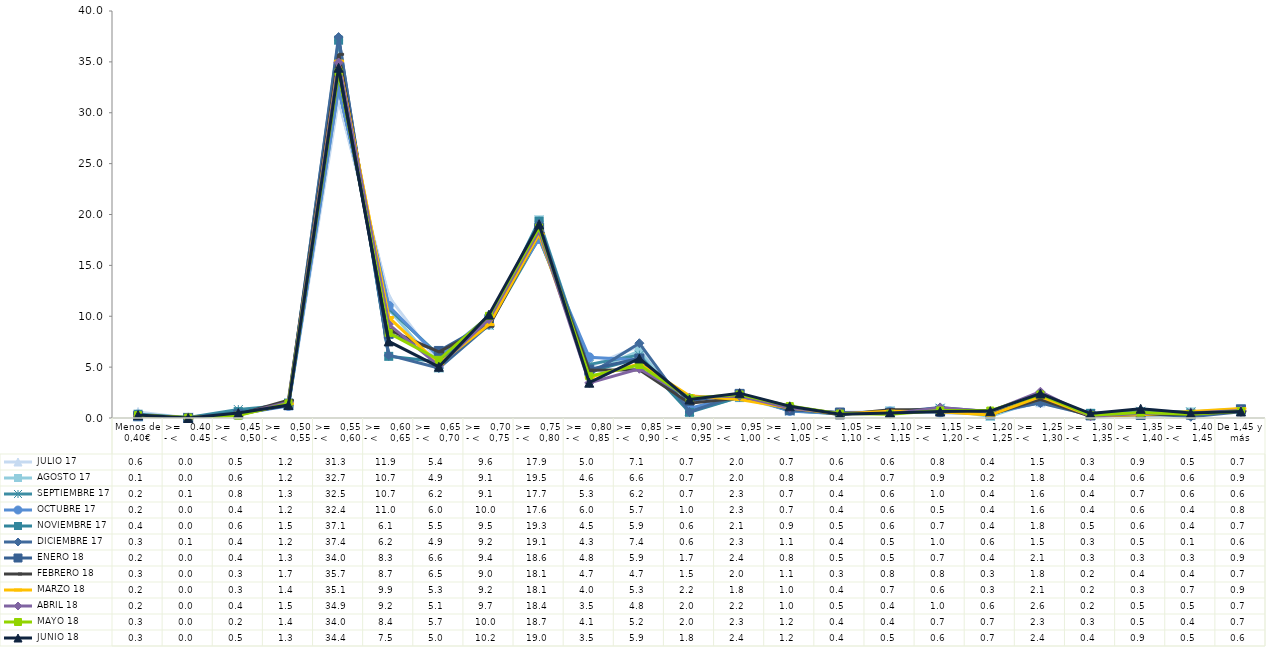
| Category |  JULIO 17 |  AGOSTO 17 |  SEPTIEMBRE 17 |  OCTUBRE 17 |  NOVIEMBRE 17 |  DICIEMBRE 17 |  ENERO 18 |  FEBRERO 18 |  MARZO 18 |  ABRIL 18 |  MAYO 18 |  JUNIO 18 |
|---|---|---|---|---|---|---|---|---|---|---|---|---|
| Menos de 0,40€ | 0.59 | 0.12 | 0.18 | 0.19 | 0.37 | 0.26 | 0.18 | 0.26 | 0.22 | 0.24 | 0.28 | 0.29 |
| >=   0.40 - <    0.45 | 0.01 | 0.01 | 0.06 | 0.01 | 0.04 | 0.05 | 0.01 | 0.01 | 0.02 | 0.01 | 0.04 | 0 |
| >=   0,45 - <    0,50 | 0.48 | 0.63 | 0.83 | 0.39 | 0.62 | 0.44 | 0.35 | 0.34 | 0.29 | 0.36 | 0.24 | 0.49 |
| >=   0,50 - <    0,55 | 1.21 | 1.23 | 1.27 | 1.19 | 1.47 | 1.24 | 1.3 | 1.74 | 1.42 | 1.54 | 1.44 | 1.27 |
| >=   0,55 - <    0,60 | 31.29 | 32.72 | 32.48 | 32.41 | 37.13 | 37.44 | 33.99 | 35.74 | 35.08 | 34.94 | 34 | 34.42 |
| >=   0,60 - <    0,65 | 11.93 | 10.7 | 10.74 | 11.03 | 6.06 | 6.18 | 8.27 | 8.67 | 9.88 | 9.21 | 8.36 | 7.53 |
| >=   0,65 - <   0,70 | 5.39 | 4.91 | 6.19 | 5.97 | 5.53 | 4.91 | 6.59 | 6.51 | 5.33 | 5.13 | 5.72 | 5.03 |
| >=   0,70 - <   0,75 | 9.55 | 9.13 | 9.14 | 9.99 | 9.48 | 9.16 | 9.36 | 9.03 | 9.18 | 9.71 | 10.04 | 10.16 |
| >=   0,75 - <   0,80 | 17.87 | 19.47 | 17.72 | 17.59 | 19.34 | 19.09 | 18.58 | 18.14 | 18.08 | 18.4 | 18.71 | 19.04 |
| >=   0,80 - <   0,85 | 5.04 | 4.59 | 5.27 | 5.97 | 4.54 | 4.29 | 4.76 | 4.69 | 3.99 | 3.45 | 4.1 | 3.47 |
| >=   0,85 - <   0,90 | 7.06 | 6.58 | 6.18 | 5.7 | 5.86 | 7.35 | 5.85 | 4.74 | 5.31 | 4.84 | 5.21 | 5.85 |
| >=   0,90 - <    0,95 | 0.69 | 0.7 | 0.73 | 0.95 | 0.56 | 0.59 | 1.68 | 1.45 | 2.19 | 2.01 | 1.95 | 1.82 |
| >=   0,95 - <   1,00 | 2.04 | 2.04 | 2.25 | 2.25 | 2.05 | 2.3 | 2.37 | 1.96 | 1.82 | 2.17 | 2.31 | 2.44 |
| >=   1,00 - <   1,05 | 0.71 | 0.78 | 0.68 | 0.7 | 0.91 | 1.08 | 0.78 | 1.09 | 0.97 | 0.99 | 1.17 | 1.15 |
| >=   1,05 - <    1,10 | 0.56 | 0.36 | 0.42 | 0.44 | 0.5 | 0.44 | 0.54 | 0.32 | 0.42 | 0.5 | 0.43 | 0.36 |
| >=   1,10 - <   1,15 | 0.61 | 0.7 | 0.56 | 0.63 | 0.55 | 0.53 | 0.51 | 0.8 | 0.66 | 0.41 | 0.37 | 0.5 |
| >=   1,15 - <    1,20 | 0.79 | 0.88 | 0.96 | 0.53 | 0.71 | 1.04 | 0.69 | 0.81 | 0.62 | 1.01 | 0.74 | 0.63 |
| >=   1,20 - <    1,25 | 0.37 | 0.16 | 0.41 | 0.41 | 0.38 | 0.61 | 0.35 | 0.34 | 0.29 | 0.63 | 0.73 | 0.68 |
| >=   1,25 - <    1,30 | 1.53 | 1.81 | 1.61 | 1.55 | 1.79 | 1.46 | 2.09 | 1.83 | 2.11 | 2.58 | 2.31 | 2.4 |
| >=   1,30 - <    1,35 | 0.26 | 0.42 | 0.42 | 0.42 | 0.46 | 0.3 | 0.26 | 0.15 | 0.22 | 0.17 | 0.27 | 0.44 |
| >=   1,35 - <    1,40 | 0.89 | 0.6 | 0.66 | 0.55 | 0.55 | 0.5 | 0.3 | 0.36 | 0.33 | 0.45 | 0.53 | 0.9 |
| >=   1,40 - <    1,45 | 0.47 | 0.59 | 0.58 | 0.37 | 0.38 | 0.12 | 0.33 | 0.36 | 0.65 | 0.5 | 0.37 | 0.48 |
| De 1,45 y más | 0.68 | 0.88 | 0.63 | 0.76 | 0.74 | 0.61 | 0.85 | 0.67 | 0.93 | 0.74 | 0.67 | 0.64 |